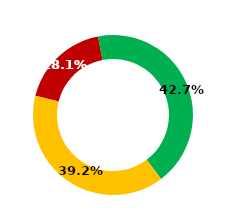
| Category | Series 1 | Series 0 | Series 2 |
|---|---|---|---|
| Retail |  |  | 0.181 |
| Domestic Institutions |  |  | 0.427 |
| Foreign Institutions (Including NVDR 100%) |  |  | 0.392 |